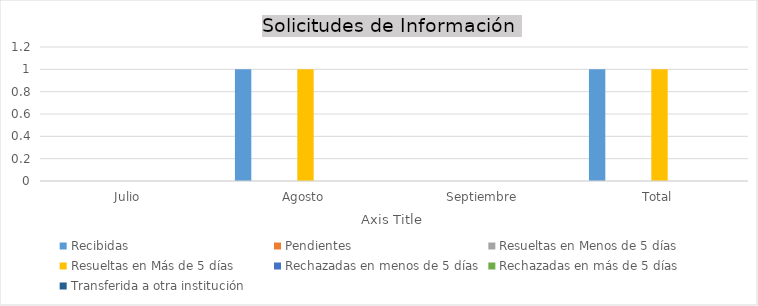
| Category | Recibidas  | Pendientes  | Resueltas en Menos de 5 días | Resueltas en Más de 5 días | Rechazadas en menos de 5 días | Rechazadas en más de 5 días | Transferida a otra institución |
|---|---|---|---|---|---|---|---|
| Julio | 0 | 0 | 0 | 0 | 0 | 0 | 0 |
| Agosto | 1 | 0 | 0 | 1 | 0 | 0 | 0 |
| Septiembre | 0 | 0 | 0 | 0 | 0 | 0 | 0 |
| Total | 1 | 0 | 0 | 1 | 0 | 0 | 0 |